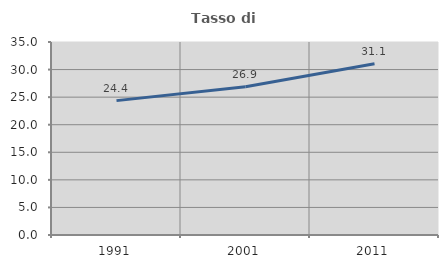
| Category | Tasso di occupazione   |
|---|---|
| 1991.0 | 24.368 |
| 2001.0 | 26.896 |
| 2011.0 | 31.058 |